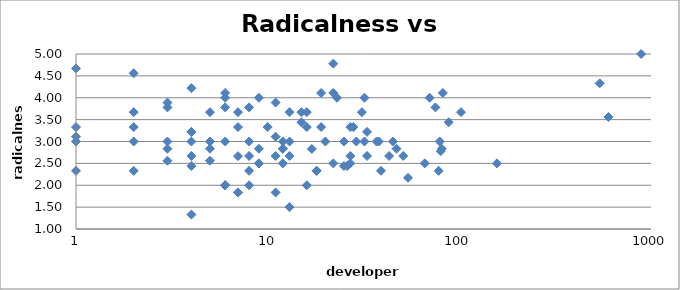
| Category | Series 0 |
|---|---|
| 1.0 | 3 |
| 2.0 | 2.33 |
| 78.0 | 2.33 |
| 1.0 | 3.33 |
| 31.0 | 3.67 |
| 25.0 | 2.44 |
| 9.0 | 4 |
| 4.0 | 1.33 |
| 3.0 | 3 |
| 54.0 | 2.17 |
| 5.0 | 3.67 |
| 17.0 | 2.83 |
| 33.0 | 3.22 |
| 8.0 | 3.78 |
| 4.0 | 3.22 |
| 32.0 | 4 |
| 1.0 | 2.33 |
| 7.0 | 2.665 |
| 7.0 | 1.835 |
| 5.0 | 3 |
| 12.0 | 2.835 |
| 9.0 | 2.835 |
| 8.0 | 2 |
| 80.0 | 2.78 |
| 5.0 | 2.56 |
| 6.0 | 3 |
| 6.0 | 3.78 |
| 3.0 | 2.56 |
| 102.0 | 3.67 |
| 22.0 | 4.11 |
| 1.0 | 3 |
| 12.0 | 3 |
| 8.0 | 3 |
| 19.0 | 3.33 |
| 6.0 | 2 |
| 15.0 | 3.44 |
| 11.0 | 3.89 |
| nan | 4.44 |
| 6.0 | 2 |
| 39.0 | 2.33 |
| 5.0 | 2.835 |
| 38.0 | 3 |
| 12.0 | 2.835 |
| 9.0 | 2.5 |
| 81.0 | 2.835 |
| 157.0 | 2.5 |
| 9.0 | 2.5 |
| 27.0 | 2.67 |
| 88.0 | 3.44 |
| 540.0 | 4.33 |
| 26.0 | 2.44 |
| 7.0 | 1.835 |
| 888.0 | 5 |
| 11.0 | 1.835 |
| 27.0 | 2.5 |
| 66.0 | 2.5 |
| 4.0 | 2.67 |
| 51.0 | 2.67 |
| 18.0 | 2.33 |
| 18.0 | 2.33 |
| 1.0 | 3.11 |
| 6.0 | 4.11 |
| 3.0 | 3.78 |
| 32.0 | 3 |
| 6.0 | 2 |
| 12.0 | 2.5 |
| 22.0 | 2.5 |
| 79.0 | 3 |
| 600.0 | 3.56 |
| 13.0 | 2.67 |
| 20.0 | 3 |
| 37.0 | 3 |
| 43.0 | 2.67 |
| 2.0 | 3.33 |
| 4.0 | 2.44 |
| 19.0 | 4.11 |
| 22.0 | 4.78 |
| 11.0 | 2.67 |
| 29.0 | 3 |
| 10.0 | 3.33 |
| 28.0 | 3.33 |
| 4.0 | 3 |
| 33.0 | 2.67 |
| 16.0 | 3.33 |
| 75.0 | 3.78 |
| 3.0 | 3.89 |
| 4.0 | 4.22 |
| 13.0 | 1.5 |
| 23.0 | 4 |
| 11.0 | 3.11 |
| 7.0 | 3.33 |
| 8.0 | 2.33 |
| 8.0 | 2.67 |
| 47.0 | 2.835 |
| 2.0 | 4.56 |
| nan | 3.56 |
| 13.0 | 3.67 |
| 3.0 | 2.835 |
| 16.0 | 2 |
| 6.0 | 4 |
| 1.0 | 3 |
| 82.0 | 4.11 |
| 7.0 | 3.67 |
| 4.0 | 3.22 |
| 27.0 | 3.33 |
| 13.0 | 3 |
| 2.0 | 3 |
| 5.0 | 3 |
| 70.0 | 4 |
| 1.0 | 4.67 |
| 45.0 | 3 |
| 2.0 | 3.67 |
| 25.0 | 3 |
| 16.0 | 3.67 |
| 15.0 | 3.67 |